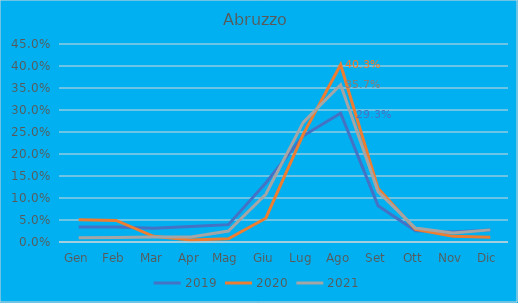
| Category | 2019 | 2020 | 2021 |
|---|---|---|---|
| Gen | 0.034 | 0.051 | 0.009 |
| Feb | 0.034 | 0.049 | 0.01 |
| Mar | 0.031 | 0.013 | 0.012 |
| Apr | 0.035 | 0.004 | 0.012 |
| Mag | 0.039 | 0.007 | 0.025 |
| Giu | 0.134 | 0.054 | 0.108 |
| Lug | 0.241 | 0.245 | 0.272 |
| Ago | 0.293 | 0.403 | 0.357 |
| Set | 0.083 | 0.122 | 0.115 |
| Ott | 0.026 | 0.028 | 0.032 |
| Nov | 0.023 | 0.013 | 0.02 |
| Dic | 0.027 | 0.011 | 0.028 |